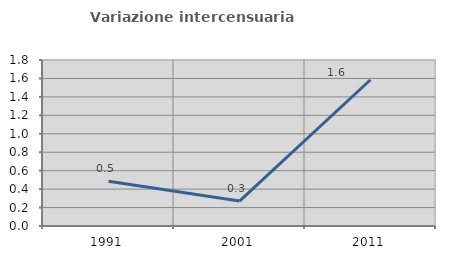
| Category | Variazione intercensuaria annua |
|---|---|
| 1991.0 | 0.484 |
| 2001.0 | 0.27 |
| 2011.0 | 1.586 |